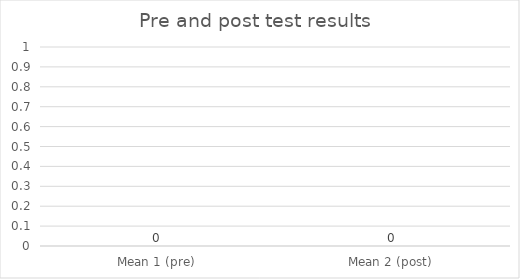
| Category | Series 0 |
|---|---|
| Mean 1 (pre) | 0 |
| Mean 2 (post) | 0 |